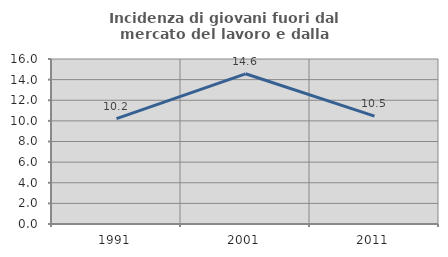
| Category | Incidenza di giovani fuori dal mercato del lavoro e dalla formazione  |
|---|---|
| 1991.0 | 10.219 |
| 2001.0 | 14.565 |
| 2011.0 | 10.458 |